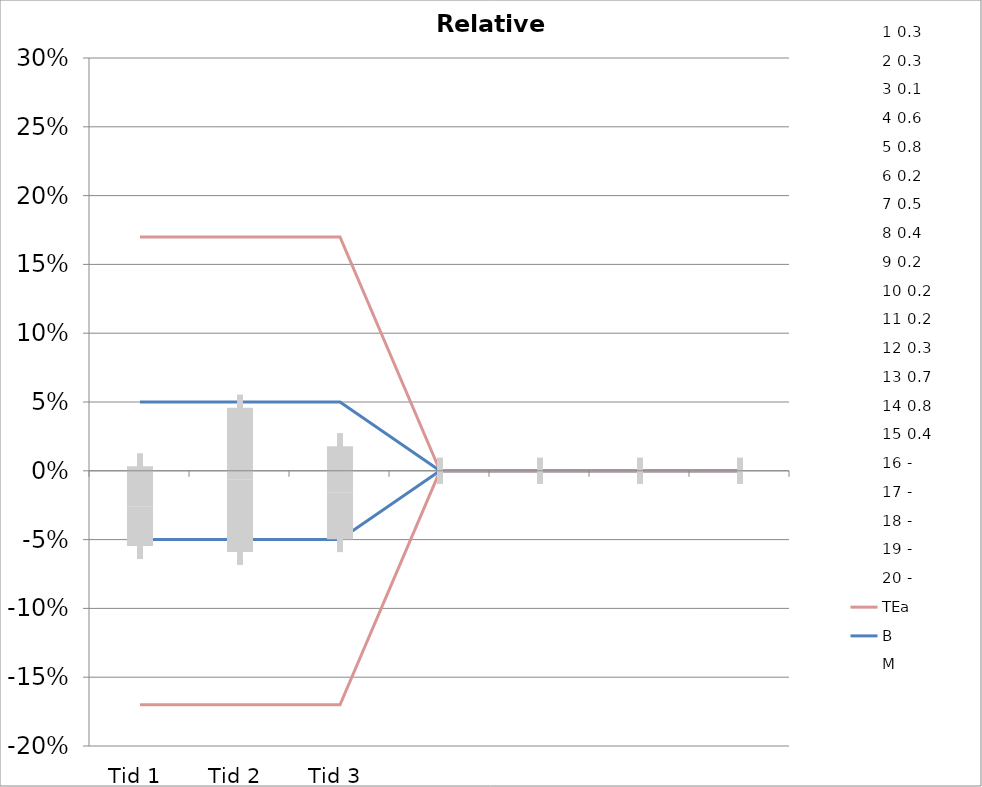
| Category | 1 | 2 | 3 | 4 | 5 | 6 | 7 | 8 | 9 | 10 | 11 | 12 | 13 | 14 | 15 | 16 | 17 | 18 | 19 | 20 | TEa | B | -B | -TEa | M |
|---|---|---|---|---|---|---|---|---|---|---|---|---|---|---|---|---|---|---|---|---|---|---|---|---|---|
| Tid 1 | -0.04 | -0.029 | -0.046 | -0.016 | -0.037 | 0.039 | -0.032 | -0.074 | 0.115 | -0.07 | -0.029 | -0.065 | -0.014 | 0.014 | -0.102 | 0 | 0 | 0 | 0 | 0 | 0.17 | 0.05 | -0.05 | -0.17 | -0.026 |
| Tid 2 | 0.056 | -0.044 | 0.031 | -0.047 | -0.005 | 0.01 | -0.042 | -0.116 | 0.256 | 0.032 | -0.174 | -0.053 | -0.045 | 0.012 | 0.03 | 0 | 0 | 0 | 0 | 0 | 0.17 | 0.05 | -0.05 | -0.17 | -0.007 |
| Tid 3 | -0.04 | -0.029 | -0.077 | -0.062 | 0 | 0.063 | -0.008 | -0.11 | 0.122 | -0.019 | -0.029 | 0.009 | -0.035 | -0.036 | 0.03 | 0 | 0 | 0 | 0 | 0 | 0.17 | 0.05 | -0.05 | -0.17 | -0.016 |